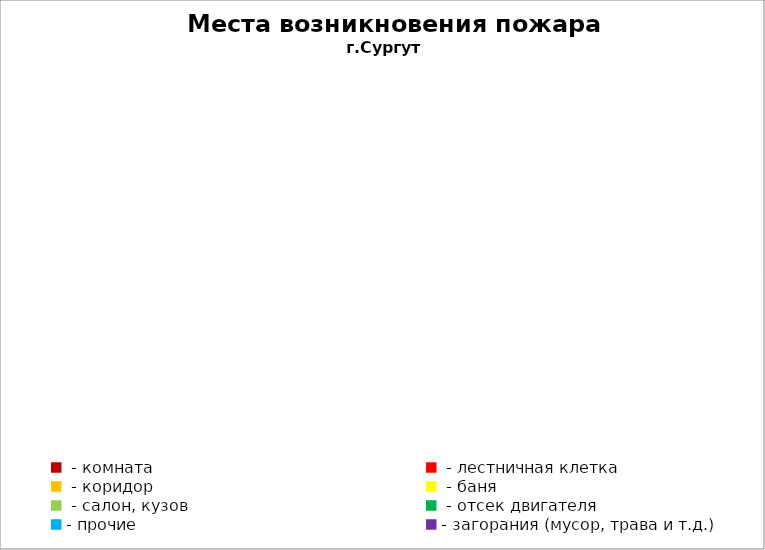
| Category | Места возникновения пожара |
|---|---|
|  - комната | 35 |
|  - лестничная клетка | 11 |
|  - коридор | 5 |
|  - баня | 12 |
|  - салон, кузов | 4 |
|  - отсек двигателя | 10 |
| - прочие | 35 |
| - загорания (мусор, трава и т.д.)  | 47 |